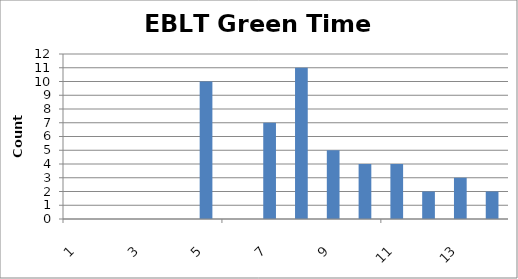
| Category | Series 0 |
|---|---|
| 0 | 0 |
| 1 | 0 |
| 2 | 0 |
| 3 | 0 |
| 4 | 10 |
| 5 | 0 |
| 6 | 7 |
| 7 | 11 |
| 8 | 5 |
| 9 | 4 |
| 10 | 4 |
| 11 | 2 |
| 12 | 3 |
| 13 | 2 |